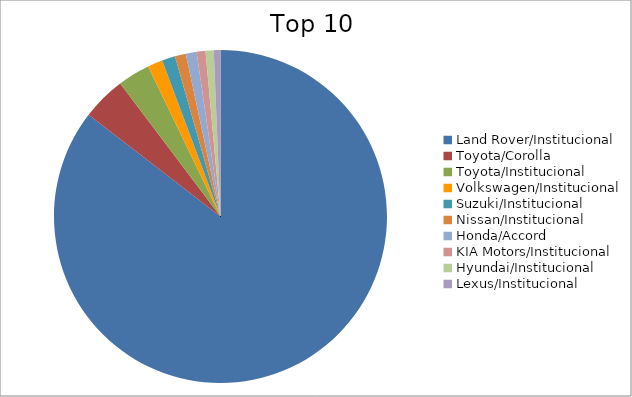
| Category | Series 0 |
|---|---|
| Land Rover/Institucional | 83.27 |
| Toyota/Corolla | 4.15 |
| Toyota/Institucional | 3.06 |
| Volkswagen/Institucional | 1.42 |
| Suzuki/Institucional | 1.25 |
| Nissan/Institucional | 1.04 |
| Honda/Accord | 1.02 |
| KIA Motors/Institucional | 0.84 |
| Hyundai/Institucional | 0.77 |
| Lexus/Institucional | 0.63 |